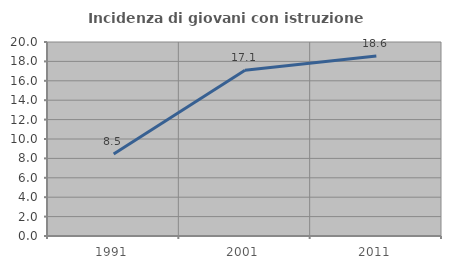
| Category | Incidenza di giovani con istruzione universitaria |
|---|---|
| 1991.0 | 8.462 |
| 2001.0 | 17.094 |
| 2011.0 | 18.557 |